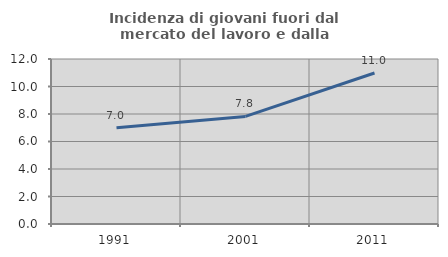
| Category | Incidenza di giovani fuori dal mercato del lavoro e dalla formazione  |
|---|---|
| 1991.0 | 7.006 |
| 2001.0 | 7.823 |
| 2011.0 | 10.98 |